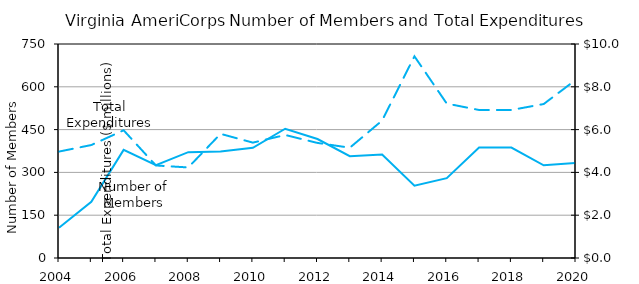
| Category | Number of Members |
|---|---|
| 2004.0 | 106 |
| 2005.0 | 197 |
| 2006.0 | 379 |
| 2007.0 | 325 |
| 2008.0 | 371 |
| 2009.0 | 373 |
| 2010.0 | 386 |
| 2011.0 | 453 |
| 2012.0 | 417 |
| 2013.0 | 357 |
| 2014.0 | 363 |
| 2015.0 | 253.38 |
| 2016.0 | 280 |
| 2017.0 | 387 |
| 2018.0 | 387 |
| 2019.0 | 325 |
| 2020.0 | 333 |